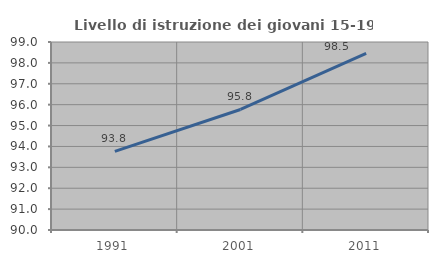
| Category | Livello di istruzione dei giovani 15-19 anni |
|---|---|
| 1991.0 | 93.765 |
| 2001.0 | 95.77 |
| 2011.0 | 98.452 |